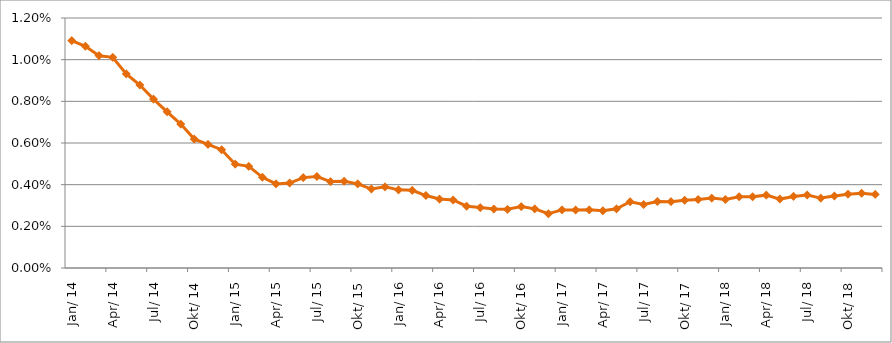
| Category | Durchschnittszins |
|---|---|
| 2014-01-01 | 0.011 |
| 2014-02-01 | 0.011 |
| 2014-03-01 | 0.01 |
| 2014-04-01 | 0.01 |
| 2014-05-01 | 0.009 |
| 2014-06-01 | 0.009 |
| 2014-07-01 | 0.008 |
| 2014-08-01 | 0.007 |
| 2014-09-01 | 0.007 |
| 2014-10-01 | 0.006 |
| 2014-11-01 | 0.006 |
| 2014-12-01 | 0.006 |
| 2015-01-01 | 0.005 |
| 2015-02-01 | 0.005 |
| 2015-03-01 | 0.004 |
| 2015-04-01 | 0.004 |
| 2015-05-01 | 0.004 |
| 2015-06-01 | 0.004 |
| 2015-07-01 | 0.004 |
| 2015-08-01 | 0.004 |
| 2015-09-01 | 0.004 |
| 2015-10-01 | 0.004 |
| 2015-11-01 | 0.004 |
| 2015-12-01 | 0.004 |
| 2016-01-01 | 0.004 |
| 2016-02-01 | 0.004 |
| 2016-03-01 | 0.003 |
| 2016-04-01 | 0.003 |
| 2016-05-01 | 0.003 |
| 2016-06-01 | 0.003 |
| 2016-07-01 | 0.003 |
| 2016-08-01 | 0.003 |
| 2016-09-01 | 0.003 |
| 2016-10-01 | 0.003 |
| 2016-11-01 | 0.003 |
| 2016-12-01 | 0.003 |
| 2017-01-01 | 0.003 |
| 2017-02-01 | 0.003 |
| 2017-03-01 | 0.003 |
| 2017-04-01 | 0.003 |
| 2017-05-01 | 0.003 |
| 2017-06-01 | 0.003 |
| 2017-07-01 | 0.003 |
| 2017-08-01 | 0.003 |
| 2017-09-01 | 0.003 |
| 2017-10-01 | 0.003 |
| 2017-11-01 | 0.003 |
| 2017-12-01 | 0.003 |
| 2018-01-01 | 0.003 |
| 2018-02-01 | 0.003 |
| 2018-03-01 | 0.003 |
| 2018-04-01 | 0.003 |
| 2018-05-01 | 0.003 |
| 2018-06-01 | 0.003 |
| 2018-07-01 | 0.004 |
| 2018-08-01 | 0.003 |
| 2018-09-01 | 0.003 |
| 2018-10-01 | 0.004 |
| 2018-11-01 | 0.004 |
| 2018-12-01 | 0.004 |